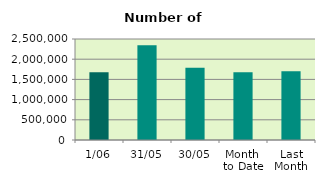
| Category | Series 0 |
|---|---|
| 1/06 | 1676414 |
| 31/05 | 2347074 |
| 30/05 | 1786804 |
| Month 
to Date | 1676414 |
| Last
Month | 1704183.636 |